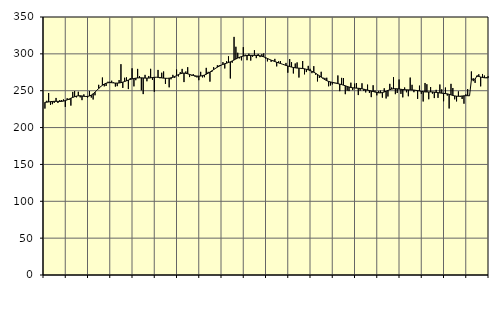
| Category | Piggar | Series 1 |
|---|---|---|
| nan | 225.8 | 234.39 |
| 1.0 | 236.3 | 234.43 |
| 1.0 | 246.9 | 234.77 |
| 1.0 | 230.7 | 235.16 |
| 1.0 | 231.7 | 235.41 |
| 1.0 | 233.5 | 235.62 |
| 1.0 | 240.2 | 235.61 |
| 1.0 | 233.3 | 235.54 |
| 1.0 | 237.2 | 235.43 |
| 1.0 | 237.4 | 235.53 |
| 1.0 | 238.2 | 235.92 |
| 1.0 | 228 | 236.61 |
| nan | 239.8 | 237.58 |
| 2.0 | 237.4 | 238.7 |
| 2.0 | 229.8 | 239.82 |
| 2.0 | 248.4 | 240.89 |
| 2.0 | 249.5 | 241.88 |
| 2.0 | 241 | 242.66 |
| 2.0 | 248.6 | 243.09 |
| 2.0 | 241 | 243.14 |
| 2.0 | 237.2 | 242.87 |
| 2.0 | 245 | 242.46 |
| 2.0 | 241.9 | 242.18 |
| 2.0 | 240.7 | 242.27 |
| nan | 249.6 | 242.89 |
| 3.0 | 240.7 | 244.08 |
| 3.0 | 238.1 | 245.83 |
| 3.0 | 243.8 | 248.04 |
| 3.0 | 250.5 | 250.5 |
| 3.0 | 258 | 253.01 |
| 3.0 | 255 | 255.37 |
| 3.0 | 267.9 | 257.44 |
| 3.0 | 255.9 | 259.09 |
| 3.0 | 256.4 | 260.21 |
| 3.0 | 262.2 | 260.83 |
| 3.0 | 262.2 | 261.03 |
| nan | 263.6 | 260.86 |
| 4.0 | 261.3 | 260.55 |
| 4.0 | 255.6 | 260.35 |
| 4.0 | 256.2 | 260.33 |
| 4.0 | 264.5 | 260.49 |
| 4.0 | 286 | 260.94 |
| 4.0 | 253.8 | 261.64 |
| 4.0 | 267.6 | 262.5 |
| 4.0 | 268.1 | 263.46 |
| 4.0 | 252.2 | 264.46 |
| 4.0 | 267.1 | 265.32 |
| 4.0 | 280.4 | 265.98 |
| nan | 255.9 | 266.53 |
| 5.0 | 264.3 | 267 |
| 5.0 | 279.6 | 267.32 |
| 5.0 | 269.8 | 267.5 |
| 5.0 | 250.6 | 267.5 |
| 5.0 | 245.4 | 267.33 |
| 5.0 | 271.5 | 267.15 |
| 5.0 | 262.8 | 267.07 |
| 5.0 | 270 | 267.17 |
| 5.0 | 279.7 | 267.46 |
| 5.0 | 264.6 | 267.85 |
| 5.0 | 248.6 | 268.15 |
| nan | 268.2 | 268.25 |
| 6.0 | 278.2 | 268.18 |
| 6.0 | 266.9 | 267.89 |
| 6.0 | 274.4 | 267.43 |
| 6.0 | 276.1 | 267.06 |
| 6.0 | 259.2 | 266.87 |
| 6.0 | 266.7 | 266.82 |
| 6.0 | 254.6 | 267 |
| 6.0 | 265.5 | 267.47 |
| 6.0 | 271.5 | 268.2 |
| 6.0 | 267.4 | 269.22 |
| 6.0 | 278.8 | 270.49 |
| nan | 269.4 | 271.87 |
| 7.0 | 275.2 | 272.99 |
| 7.0 | 279.6 | 273.7 |
| 7.0 | 261.7 | 273.93 |
| 7.0 | 276.1 | 273.63 |
| 7.0 | 281.9 | 272.95 |
| 7.0 | 268.5 | 272.13 |
| 7.0 | 270.6 | 271.34 |
| 7.0 | 272.5 | 270.68 |
| 7.0 | 268.9 | 270.17 |
| 7.0 | 268 | 269.85 |
| 7.0 | 264.3 | 269.75 |
| nan | 275.6 | 269.92 |
| 8.0 | 268.1 | 270.4 |
| 8.0 | 268.3 | 271.22 |
| 8.0 | 281 | 272.37 |
| 8.0 | 275.6 | 273.75 |
| 8.0 | 262.3 | 275.29 |
| 8.0 | 275.4 | 276.94 |
| 8.0 | 281.9 | 278.64 |
| 8.0 | 279.9 | 280.33 |
| 8.0 | 284.5 | 281.9 |
| 8.0 | 284.6 | 283.32 |
| 8.0 | 284.4 | 284.6 |
| nan | 288.8 | 285.68 |
| 9.0 | 280.2 | 286.57 |
| 9.0 | 290 | 287.4 |
| 9.0 | 296.7 | 288.25 |
| 9.0 | 266.6 | 289.2 |
| 9.0 | 288 | 290.37 |
| 9.0 | 323 | 291.68 |
| 9.0 | 309.6 | 293.02 |
| 9.0 | 301.5 | 294.29 |
| 9.0 | 293.9 | 295.43 |
| 9.0 | 291.2 | 296.34 |
| 9.0 | 309.1 | 297.01 |
| nan | 298.9 | 297.44 |
| 10.0 | 291.4 | 297.7 |
| 10.0 | 300.3 | 297.86 |
| 10.0 | 290.9 | 297.94 |
| 10.0 | 296 | 297.97 |
| 10.0 | 304.9 | 297.99 |
| 10.0 | 294.2 | 297.93 |
| 10.0 | 299.9 | 297.74 |
| 10.0 | 295.6 | 297.38 |
| 10.0 | 299.6 | 296.76 |
| 10.0 | 300.7 | 295.94 |
| 10.0 | 293.7 | 294.9 |
| nan | 289.8 | 293.74 |
| 11.0 | 292.3 | 292.59 |
| 11.0 | 289.2 | 291.49 |
| 11.0 | 291.1 | 290.49 |
| 11.0 | 293.2 | 289.58 |
| 11.0 | 283 | 288.65 |
| 11.0 | 289.8 | 287.77 |
| 11.0 | 290.3 | 286.94 |
| 11.0 | 286.1 | 286.08 |
| 11.0 | 285.3 | 285.21 |
| 11.0 | 287.7 | 284.34 |
| 11.0 | 274.4 | 283.51 |
| nan | 292.9 | 282.75 |
| 12.0 | 288.7 | 282.1 |
| 12.0 | 273.4 | 281.53 |
| 12.0 | 286.9 | 281.06 |
| 12.0 | 288.4 | 280.74 |
| 12.0 | 267.9 | 280.54 |
| 12.0 | 279.9 | 280.38 |
| 12.0 | 290.3 | 280.11 |
| 12.0 | 272.2 | 279.67 |
| 12.0 | 275.3 | 279.04 |
| 12.0 | 283.7 | 278.25 |
| 12.0 | 279.7 | 277.34 |
| nan | 273.8 | 276.32 |
| 13.0 | 283.3 | 275.11 |
| 13.0 | 271.7 | 273.69 |
| 13.0 | 262.6 | 272.05 |
| 13.0 | 267.4 | 270.26 |
| 13.0 | 275.7 | 268.41 |
| 13.0 | 267.8 | 266.6 |
| 13.0 | 267.4 | 264.95 |
| 13.0 | 267.6 | 263.59 |
| 13.0 | 256 | 262.61 |
| 13.0 | 257.1 | 261.89 |
| 13.0 | 258.5 | 261.32 |
| nan | 260.2 | 260.79 |
| 14.0 | 260.7 | 260.21 |
| 14.0 | 270.7 | 259.59 |
| 14.0 | 249.4 | 258.98 |
| 14.0 | 267.4 | 258.32 |
| 14.0 | 267.2 | 257.55 |
| 14.0 | 245.3 | 256.69 |
| 14.0 | 250.1 | 255.81 |
| 14.0 | 249.5 | 254.98 |
| 14.0 | 260.9 | 254.37 |
| 14.0 | 250.8 | 253.96 |
| 14.0 | 259.6 | 253.71 |
| nan | 260.4 | 253.53 |
| 15.0 | 244.1 | 253.34 |
| 15.0 | 250.2 | 253.03 |
| 15.0 | 260.1 | 252.6 |
| 15.0 | 249.7 | 252.05 |
| 15.0 | 247.7 | 251.4 |
| 15.0 | 258.3 | 250.78 |
| 15.0 | 247 | 250.21 |
| 15.0 | 241.3 | 249.62 |
| 15.0 | 257.4 | 248.92 |
| 15.0 | 250.3 | 248.18 |
| 15.0 | 243.7 | 247.59 |
| nan | 249.7 | 247.18 |
| 16.0 | 250.1 | 247.11 |
| 16.0 | 240.6 | 247.49 |
| 16.0 | 253.3 | 248.24 |
| 16.0 | 239.5 | 249.22 |
| 16.0 | 242.2 | 250.38 |
| 16.0 | 259.3 | 251.43 |
| 16.0 | 254.4 | 252.18 |
| 16.0 | 268.4 | 252.62 |
| 16.0 | 245.3 | 252.74 |
| 16.0 | 246.9 | 252.6 |
| 16.0 | 265.2 | 252.29 |
| nan | 245.7 | 251.92 |
| 17.0 | 241 | 251.62 |
| 17.0 | 254.4 | 251.4 |
| 17.0 | 247.9 | 251.23 |
| 17.0 | 242.5 | 251.15 |
| 17.0 | 267.8 | 251.12 |
| 17.0 | 258 | 251.04 |
| 17.0 | 248 | 250.85 |
| 17.0 | 250.9 | 250.53 |
| 17.0 | 238.9 | 250.13 |
| 17.0 | 256.9 | 249.68 |
| 17.0 | 245.8 | 249.16 |
| nan | 235.4 | 248.7 |
| 18.0 | 260.5 | 248.4 |
| 18.0 | 258.8 | 248.27 |
| 18.0 | 238.4 | 248.32 |
| 18.0 | 255 | 248.42 |
| 18.0 | 246 | 248.36 |
| 18.0 | 240 | 248.08 |
| 18.0 | 251.2 | 247.72 |
| 18.0 | 240.3 | 247.34 |
| 18.0 | 258.4 | 246.97 |
| 18.0 | 251.9 | 246.64 |
| 18.0 | 235.7 | 246.36 |
| nan | 254.3 | 246.1 |
| 19.0 | 243.4 | 245.73 |
| 19.0 | 225.9 | 245.12 |
| 19.0 | 259.3 | 244.35 |
| 19.0 | 253.7 | 243.59 |
| 19.0 | 238.3 | 242.95 |
| 19.0 | 235.5 | 242.57 |
| 19.0 | 249.1 | 242.45 |
| 19.0 | 241.7 | 242.58 |
| 19.0 | 238.8 | 242.84 |
| 19.0 | 232.4 | 243.08 |
| 19.0 | 245.1 | 243.24 |
| nan | 252.2 | 243.26 |
| 20.0 | 243.1 | 243.07 |
| 20.0 | 276.1 | 264.74 |
| 20.0 | 263 | 266.26 |
| 20.0 | 260.6 | 265.37 |
| 20.0 | 268.6 | 270.31 |
| 20.0 | 272.3 | 269.37 |
| 20.0 | 255.9 | 268.56 |
| 20.0 | 272.7 | 267.92 |
| 20.0 | 270.6 | 267.54 |
| 20.0 | 268.5 | 267.41 |
| 20.0 | 269.7 | 267.45 |